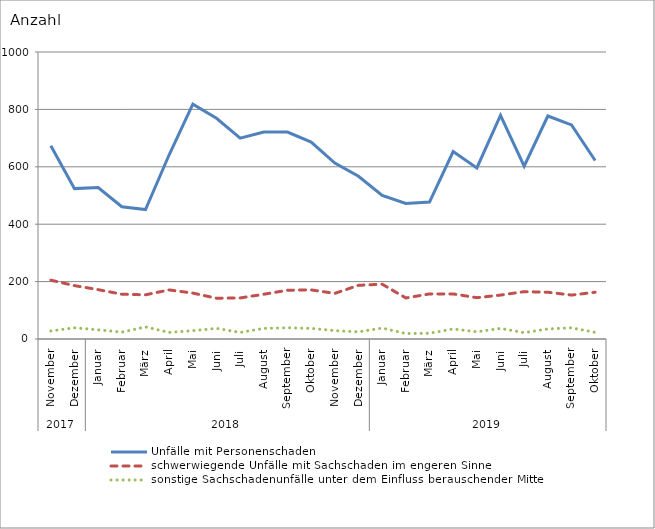
| Category | Unfälle mit Personenschaden | schwerwiegende Unfälle mit Sachschaden im engeren Sinne | sonstige Sachschadenunfälle unter dem Einfluss berauschender Mittel |
|---|---|---|---|
| 0 | 673 | 205 | 28 |
| 1 | 524 | 186 | 39 |
| 2 | 528 | 172 | 32 |
| 3 | 461 | 156 | 24 |
| 4 | 451 | 154 | 42 |
| 5 | 642 | 171 | 23 |
| 6 | 818 | 160 | 29 |
| 7 | 769 | 142 | 37 |
| 8 | 700 | 143 | 23 |
| 9 | 721 | 156 | 37 |
| 10 | 721 | 170 | 39 |
| 11 | 686 | 171 | 37 |
| 12 | 613 | 159 | 29 |
| 13 | 567 | 187 | 25 |
| 14 | 500 | 191 | 38 |
| 15 | 472 | 143 | 19 |
| 16 | 477 | 157 | 20 |
| 17 | 653 | 157 | 35 |
| 18 | 596 | 144 | 25 |
| 19 | 779 | 153 | 37 |
| 20 | 602 | 165 | 22 |
| 21 | 777 | 163 | 35 |
| 22 | 746 | 153 | 39 |
| 23 | 622 | 163 | 23 |